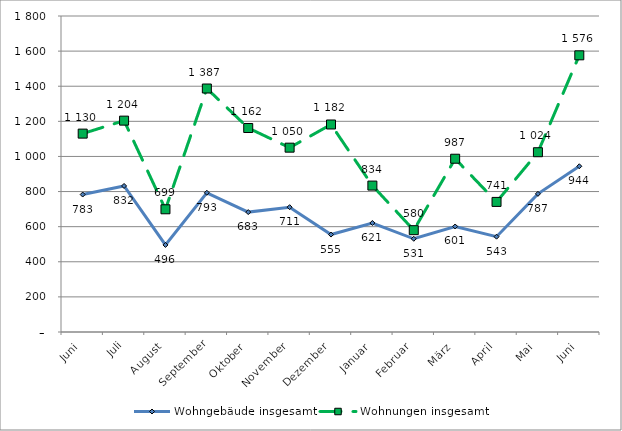
| Category | Wohngebäude insgesamt | Wohnungen insgesamt |
|---|---|---|
| Juni | 783 | 1130 |
| Juli | 832 | 1204 |
| August | 496 | 699 |
| September | 793 | 1387 |
| Oktober | 683 | 1162 |
| November | 711 | 1050 |
| Dezember | 555 | 1182 |
| Januar | 621 | 834 |
| Februar | 531 | 580 |
| März | 601 | 987 |
| April | 543 | 741 |
| Mai | 787 | 1024 |
| Juni | 944 | 1576 |